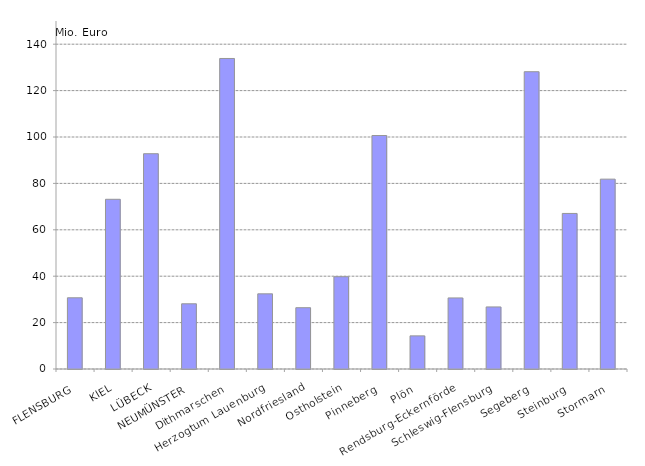
| Category | Series 0 |
|---|---|
| FLENSBURG | 30.691 |
| KIEL | 73.15 |
| LÜBECK | 92.795 |
| NEUMÜNSTER | 28.105 |
| Dithmarschen | 133.845 |
| Herzogtum Lauenburg | 32.402 |
| Nordfriesland | 26.423 |
| Ostholstein | 39.779 |
| Pinneberg | 100.637 |
| Plön | 14.279 |
| Rendsburg-Eckernförde | 30.632 |
| Schleswig-Flensburg | 26.747 |
| Segeberg | 128.142 |
| Steinburg | 67.051 |
| Stormarn | 81.834 |